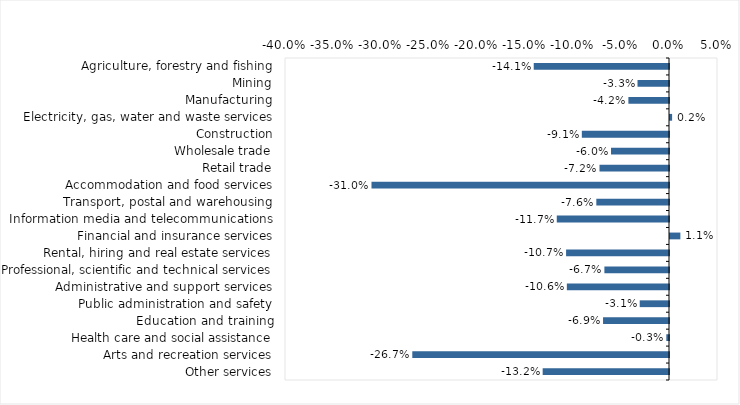
| Category | This week |
|---|---|
| Agriculture, forestry and fishing | -0.141 |
| Mining | -0.033 |
| Manufacturing | -0.042 |
| Electricity, gas, water and waste services | 0.002 |
| Construction | -0.091 |
| Wholesale trade | -0.06 |
| Retail trade | -0.072 |
| Accommodation and food services | -0.31 |
| Transport, postal and warehousing | -0.076 |
| Information media and telecommunications | -0.117 |
| Financial and insurance services | 0.011 |
| Rental, hiring and real estate services | -0.107 |
| Professional, scientific and technical services | -0.067 |
| Administrative and support services | -0.106 |
| Public administration and safety | -0.03 |
| Education and training | -0.069 |
| Health care and social assistance | -0.003 |
| Arts and recreation services | -0.267 |
| Other services | -0.132 |